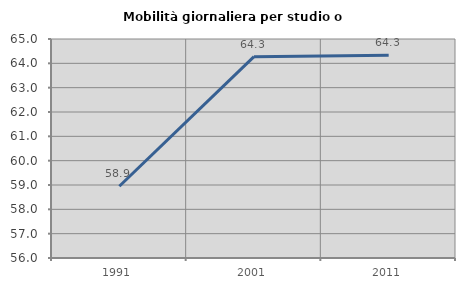
| Category | Mobilità giornaliera per studio o lavoro |
|---|---|
| 1991.0 | 58.948 |
| 2001.0 | 64.273 |
| 2011.0 | 64.33 |